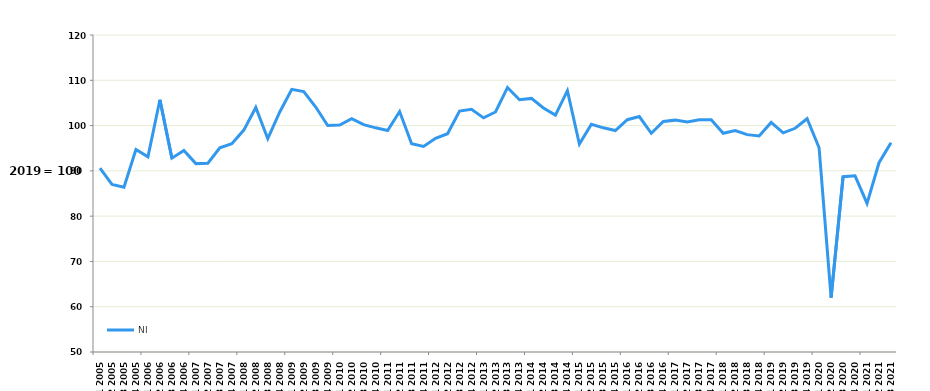
| Category | NI |
|---|---|
| Q1 2005 | 90.6 |
| Q2 2005 | 87 |
| Q3 2005 | 86.4 |
| Q4 2005 | 94.7 |
| Q1 2006 | 93.1 |
| Q2 2006 | 105.7 |
| Q3 2006 | 92.8 |
| Q4 2006 | 94.5 |
| Q1 2007 | 91.6 |
| Q2 2007 | 91.7 |
| Q3 2007 | 95.1 |
| Q4 2007 | 96 |
| Q1 2008 | 99 |
| Q2 2008 | 104 |
| Q3 2008 | 97.1 |
| Q4 2008 | 103 |
| Q1 2009 | 108 |
| Q2 2009 | 107.5 |
| Q3 2009 | 104.1 |
| Q4 2009 | 100 |
| Q1 2010 | 100.1 |
| Q2 2010 | 101.5 |
| Q3 2010 | 100.2 |
| Q4 2010 | 99.5 |
| Q1 2011 | 98.9 |
| Q2 2011 | 103.1 |
| Q3 2011 | 96 |
| Q4 2011 | 95.4 |
| Q1 2012 | 97.2 |
| Q2 2012 | 98.2 |
| Q3 2012 | 103.2 |
| Q4 2012 | 103.6 |
| Q1 2013 | 101.7 |
| Q2 2013 | 103 |
| Q3 2013 | 108.4 |
| Q4 2013 | 105.7 |
| Q1 2014 | 106 |
| Q2 2014 | 103.9 |
| Q3 2014 | 102.3 |
| Q4 2014 | 107.7 |
| Q1 2015 | 95.9 |
| Q2 2015 | 100.3 |
| Q3 2015 | 99.5 |
| Q4 2015 | 98.9 |
| Q1 2016 | 101.3 |
| Q2 2016 | 102 |
| Q3 2016 | 98.3 |
| Q4 2016 | 100.9 |
| Q1 2017 | 101.2 |
| Q2 2017 | 100.8 |
| Q3 2017 | 101.3 |
| Q4 2017 | 101.3 |
| Q1 2018 | 98.3 |
| Q2 2018 | 98.9 |
| Q3 2018 | 98 |
| Q4 2018 | 97.7 |
| Q1 2019 | 100.7 |
| Q2 2019 | 98.4 |
| Q3 2019 | 99.4 |
| Q4 2019 | 101.5 |
| Q1 2020 | 95.1 |
| Q2 2020 | 62 |
| Q3 2020 | 88.7 |
| Q4 2020 | 88.9 |
| Q1 2021 | 82.8 |
| Q2 2021 | 91.8 |
| Q3 2021 | 96.2 |